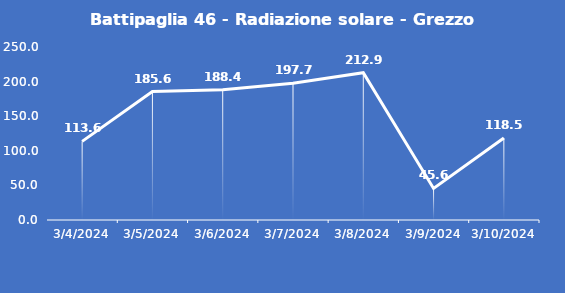
| Category | Battipaglia 46 - Radiazione solare - Grezzo (W/m2) |
|---|---|
| 3/4/24 | 113.6 |
| 3/5/24 | 185.6 |
| 3/6/24 | 188.4 |
| 3/7/24 | 197.7 |
| 3/8/24 | 212.9 |
| 3/9/24 | 45.6 |
| 3/10/24 | 118.5 |